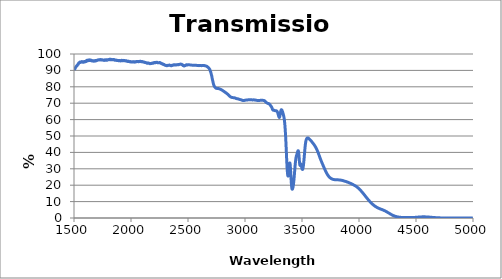
| Category | Transmission |
|---|---|
| 1500.0 | 90.192 |
| 1501.0 | 90.39 |
| 1502.0 | 90.507 |
| 1503.0 | 90.714 |
| 1504.0 | 90.801 |
| 1505.0 | 90.857 |
| 1506.0 | 90.826 |
| 1507.0 | 90.875 |
| 1508.0 | 91.009 |
| 1509.0 | 91.192 |
| 1510.0 | 91.222 |
| 1511.0 | 91.343 |
| 1512.0 | 91.464 |
| 1513.0 | 91.628 |
| 1514.0 | 91.71 |
| 1515.0 | 91.937 |
| 1516.0 | 92.037 |
| 1517.0 | 92.17 |
| 1518.0 | 92.23 |
| 1519.0 | 92.243 |
| 1520.0 | 92.317 |
| 1521.0 | 92.495 |
| 1522.0 | 92.629 |
| 1523.0 | 92.683 |
| 1524.0 | 92.743 |
| 1525.0 | 92.886 |
| 1526.0 | 92.887 |
| 1527.0 | 92.98 |
| 1528.0 | 92.962 |
| 1529.0 | 93.161 |
| 1530.0 | 93.221 |
| 1531.0 | 93.323 |
| 1532.0 | 93.479 |
| 1533.0 | 93.549 |
| 1534.0 | 93.686 |
| 1535.0 | 93.675 |
| 1536.0 | 93.721 |
| 1537.0 | 93.739 |
| 1538.0 | 93.876 |
| 1539.0 | 94.169 |
| 1540.0 | 94.277 |
| 1541.0 | 94.347 |
| 1542.0 | 94.496 |
| 1543.0 | 94.578 |
| 1544.0 | 94.555 |
| 1545.0 | 94.531 |
| 1546.0 | 94.59 |
| 1547.0 | 94.668 |
| 1548.0 | 94.731 |
| 1549.0 | 94.984 |
| 1550.0 | 94.973 |
| 1551.0 | 95.016 |
| 1552.0 | 95.062 |
| 1553.0 | 94.947 |
| 1554.0 | 94.846 |
| 1555.0 | 94.851 |
| 1556.0 | 94.975 |
| 1557.0 | 95.104 |
| 1558.0 | 95.114 |
| 1559.0 | 95.06 |
| 1560.0 | 95.008 |
| 1561.0 | 95.034 |
| 1562.0 | 95.023 |
| 1563.0 | 95.197 |
| 1564.0 | 95.193 |
| 1565.0 | 95.229 |
| 1566.0 | 95.118 |
| 1567.0 | 95.145 |
| 1568.0 | 95.323 |
| 1569.0 | 95.377 |
| 1570.0 | 95.363 |
| 1571.0 | 95.314 |
| 1572.0 | 95.086 |
| 1573.0 | 95.16 |
| 1574.0 | 95.29 |
| 1575.0 | 95.277 |
| 1576.0 | 95.332 |
| 1577.0 | 95.221 |
| 1578.0 | 94.993 |
| 1579.0 | 94.932 |
| 1580.0 | 94.945 |
| 1581.0 | 95.099 |
| 1582.0 | 95.196 |
| 1583.0 | 95.175 |
| 1584.0 | 95.117 |
| 1585.0 | 95.043 |
| 1586.0 | 95.085 |
| 1587.0 | 95.029 |
| 1588.0 | 95.163 |
| 1589.0 | 95.374 |
| 1590.0 | 95.246 |
| 1591.0 | 95.268 |
| 1592.0 | 95.325 |
| 1593.0 | 95.347 |
| 1594.0 | 95.393 |
| 1595.0 | 95.426 |
| 1596.0 | 95.442 |
| 1597.0 | 95.439 |
| 1598.0 | 95.24 |
| 1599.0 | 95.276 |
| 1600.0 | 95.303 |
| 1601.0 | 95.324 |
| 1602.0 | 95.355 |
| 1603.0 | 95.332 |
| 1604.0 | 95.357 |
| 1605.0 | 95.394 |
| 1606.0 | 95.512 |
| 1607.0 | 95.54 |
| 1608.0 | 95.638 |
| 1609.0 | 95.794 |
| 1610.0 | 95.909 |
| 1611.0 | 96.09 |
| 1612.0 | 96.094 |
| 1613.0 | 96.023 |
| 1614.0 | 96.055 |
| 1615.0 | 96.151 |
| 1616.0 | 96.242 |
| 1617.0 | 96.211 |
| 1618.0 | 96.172 |
| 1619.0 | 96.041 |
| 1620.0 | 95.819 |
| 1621.0 | 95.813 |
| 1622.0 | 95.86 |
| 1623.0 | 95.901 |
| 1624.0 | 96.059 |
| 1625.0 | 96.318 |
| 1626.0 | 96.321 |
| 1627.0 | 96.291 |
| 1628.0 | 96.278 |
| 1629.0 | 96.178 |
| 1630.0 | 96.104 |
| 1631.0 | 96.131 |
| 1632.0 | 96.218 |
| 1633.0 | 96.36 |
| 1634.0 | 96.412 |
| 1635.0 | 96.402 |
| 1636.0 | 96.258 |
| 1637.0 | 96.053 |
| 1638.0 | 96.035 |
| 1639.0 | 96.176 |
| 1640.0 | 96.398 |
| 1641.0 | 96.395 |
| 1642.0 | 96.276 |
| 1643.0 | 96.129 |
| 1644.0 | 96.094 |
| 1645.0 | 96.072 |
| 1646.0 | 96.179 |
| 1647.0 | 96.149 |
| 1648.0 | 96.19 |
| 1649.0 | 96.11 |
| 1650.0 | 95.949 |
| 1651.0 | 95.879 |
| 1652.0 | 95.954 |
| 1653.0 | 96.137 |
| 1654.0 | 96.154 |
| 1655.0 | 96.104 |
| 1656.0 | 96.026 |
| 1657.0 | 95.887 |
| 1658.0 | 95.745 |
| 1659.0 | 95.753 |
| 1660.0 | 95.731 |
| 1661.0 | 95.852 |
| 1662.0 | 95.941 |
| 1663.0 | 95.874 |
| 1664.0 | 95.876 |
| 1665.0 | 95.908 |
| 1666.0 | 95.904 |
| 1667.0 | 95.845 |
| 1668.0 | 95.808 |
| 1669.0 | 95.835 |
| 1670.0 | 95.864 |
| 1671.0 | 95.86 |
| 1672.0 | 95.788 |
| 1673.0 | 95.632 |
| 1674.0 | 95.595 |
| 1675.0 | 95.673 |
| 1676.0 | 95.668 |
| 1677.0 | 95.751 |
| 1678.0 | 95.862 |
| 1679.0 | 95.884 |
| 1680.0 | 95.919 |
| 1681.0 | 95.929 |
| 1682.0 | 95.798 |
| 1683.0 | 95.681 |
| 1684.0 | 95.704 |
| 1685.0 | 95.829 |
| 1686.0 | 95.945 |
| 1687.0 | 96.01 |
| 1688.0 | 96.076 |
| 1689.0 | 96.053 |
| 1690.0 | 95.92 |
| 1691.0 | 95.791 |
| 1692.0 | 95.814 |
| 1693.0 | 95.797 |
| 1694.0 | 95.892 |
| 1695.0 | 96.042 |
| 1696.0 | 96.017 |
| 1697.0 | 95.972 |
| 1698.0 | 96.06 |
| 1699.0 | 96.137 |
| 1700.0 | 96.049 |
| 1701.0 | 96.004 |
| 1702.0 | 96.073 |
| 1703.0 | 96.084 |
| 1704.0 | 96.167 |
| 1705.0 | 96.26 |
| 1706.0 | 96.259 |
| 1707.0 | 96.254 |
| 1708.0 | 96.308 |
| 1709.0 | 96.409 |
| 1710.0 | 96.33 |
| 1711.0 | 96.271 |
| 1712.0 | 96.323 |
| 1713.0 | 96.312 |
| 1714.0 | 96.309 |
| 1715.0 | 96.365 |
| 1716.0 | 96.413 |
| 1717.0 | 96.462 |
| 1718.0 | 96.512 |
| 1719.0 | 96.534 |
| 1720.0 | 96.553 |
| 1721.0 | 96.57 |
| 1722.0 | 96.489 |
| 1723.0 | 96.416 |
| 1724.0 | 96.401 |
| 1725.0 | 96.378 |
| 1726.0 | 96.332 |
| 1727.0 | 96.372 |
| 1728.0 | 96.398 |
| 1729.0 | 96.439 |
| 1730.0 | 96.564 |
| 1731.0 | 96.603 |
| 1732.0 | 96.508 |
| 1733.0 | 96.479 |
| 1734.0 | 96.547 |
| 1735.0 | 96.451 |
| 1736.0 | 96.393 |
| 1737.0 | 96.409 |
| 1738.0 | 96.375 |
| 1739.0 | 96.328 |
| 1740.0 | 96.346 |
| 1741.0 | 96.465 |
| 1742.0 | 96.57 |
| 1743.0 | 96.521 |
| 1744.0 | 96.49 |
| 1745.0 | 96.454 |
| 1746.0 | 96.409 |
| 1747.0 | 96.458 |
| 1748.0 | 96.489 |
| 1749.0 | 96.37 |
| 1750.0 | 96.33 |
| 1751.0 | 96.355 |
| 1752.0 | 96.297 |
| 1753.0 | 96.295 |
| 1754.0 | 96.267 |
| 1755.0 | 96.293 |
| 1756.0 | 96.22 |
| 1757.0 | 96.182 |
| 1758.0 | 96.198 |
| 1759.0 | 96.284 |
| 1760.0 | 96.258 |
| 1761.0 | 96.207 |
| 1762.0 | 96.209 |
| 1763.0 | 96.118 |
| 1764.0 | 96.062 |
| 1765.0 | 96.15 |
| 1766.0 | 96.146 |
| 1767.0 | 96.216 |
| 1768.0 | 96.203 |
| 1769.0 | 96.2 |
| 1770.0 | 96.359 |
| 1771.0 | 96.449 |
| 1772.0 | 96.456 |
| 1773.0 | 96.415 |
| 1774.0 | 96.347 |
| 1775.0 | 96.254 |
| 1776.0 | 96.317 |
| 1777.0 | 96.353 |
| 1778.0 | 96.186 |
| 1779.0 | 96.246 |
| 1780.0 | 96.381 |
| 1781.0 | 96.387 |
| 1782.0 | 96.231 |
| 1783.0 | 96.395 |
| 1784.0 | 96.26 |
| 1785.0 | 96.48 |
| 1786.0 | 96.549 |
| 1787.0 | 96.333 |
| 1788.0 | 96.288 |
| 1789.0 | 96.251 |
| 1790.0 | 96.186 |
| 1791.0 | 96.246 |
| 1792.0 | 96.293 |
| 1793.0 | 96.333 |
| 1794.0 | 96.481 |
| 1795.0 | 96.443 |
| 1796.0 | 96.433 |
| 1797.0 | 96.484 |
| 1798.0 | 96.421 |
| 1799.0 | 96.489 |
| 1800.0 | 96.562 |
| 1801.0 | 96.566 |
| 1802.0 | 96.513 |
| 1803.0 | 96.463 |
| 1804.0 | 96.418 |
| 1805.0 | 96.456 |
| 1806.0 | 96.573 |
| 1807.0 | 96.556 |
| 1808.0 | 96.441 |
| 1809.0 | 96.561 |
| 1810.0 | 96.66 |
| 1811.0 | 96.771 |
| 1812.0 | 96.768 |
| 1813.0 | 96.688 |
| 1814.0 | 96.746 |
| 1815.0 | 96.758 |
| 1816.0 | 96.737 |
| 1817.0 | 96.665 |
| 1818.0 | 96.54 |
| 1819.0 | 96.615 |
| 1820.0 | 96.733 |
| 1821.0 | 96.699 |
| 1822.0 | 96.573 |
| 1823.0 | 96.577 |
| 1824.0 | 96.633 |
| 1825.0 | 96.745 |
| 1826.0 | 96.654 |
| 1827.0 | 96.574 |
| 1828.0 | 96.552 |
| 1829.0 | 96.52 |
| 1830.0 | 96.514 |
| 1831.0 | 96.695 |
| 1832.0 | 96.664 |
| 1833.0 | 96.566 |
| 1834.0 | 96.586 |
| 1835.0 | 96.532 |
| 1836.0 | 96.456 |
| 1837.0 | 96.602 |
| 1838.0 | 96.582 |
| 1839.0 | 96.698 |
| 1840.0 | 96.606 |
| 1841.0 | 96.553 |
| 1842.0 | 96.569 |
| 1843.0 | 96.687 |
| 1844.0 | 96.623 |
| 1845.0 | 96.692 |
| 1846.0 | 96.578 |
| 1847.0 | 96.516 |
| 1848.0 | 96.602 |
| 1849.0 | 96.57 |
| 1850.0 | 96.588 |
| 1851.0 | 96.606 |
| 1852.0 | 96.56 |
| 1853.0 | 96.413 |
| 1854.0 | 96.379 |
| 1855.0 | 96.311 |
| 1856.0 | 96.377 |
| 1857.0 | 96.361 |
| 1858.0 | 96.372 |
| 1859.0 | 96.21 |
| 1860.0 | 96.122 |
| 1861.0 | 96.185 |
| 1862.0 | 96.26 |
| 1863.0 | 96.2 |
| 1864.0 | 96.22 |
| 1865.0 | 96.229 |
| 1866.0 | 96.241 |
| 1867.0 | 96.338 |
| 1868.0 | 96.311 |
| 1869.0 | 96.269 |
| 1870.0 | 96.196 |
| 1871.0 | 96.141 |
| 1872.0 | 96.145 |
| 1873.0 | 96.147 |
| 1874.0 | 96.06 |
| 1875.0 | 96.119 |
| 1876.0 | 96.103 |
| 1877.0 | 96.079 |
| 1878.0 | 96.031 |
| 1879.0 | 96.038 |
| 1880.0 | 96.005 |
| 1881.0 | 96.116 |
| 1882.0 | 96.1 |
| 1883.0 | 96.053 |
| 1884.0 | 96.017 |
| 1885.0 | 96.053 |
| 1886.0 | 96.106 |
| 1887.0 | 96.084 |
| 1888.0 | 95.973 |
| 1889.0 | 95.901 |
| 1890.0 | 95.992 |
| 1891.0 | 95.876 |
| 1892.0 | 95.848 |
| 1893.0 | 95.936 |
| 1894.0 | 95.918 |
| 1895.0 | 95.916 |
| 1896.0 | 95.835 |
| 1897.0 | 95.879 |
| 1898.0 | 96.025 |
| 1899.0 | 95.989 |
| 1900.0 | 95.948 |
| 1901.0 | 95.973 |
| 1902.0 | 95.957 |
| 1903.0 | 95.895 |
| 1904.0 | 95.92 |
| 1905.0 | 95.805 |
| 1906.0 | 95.885 |
| 1907.0 | 95.932 |
| 1908.0 | 95.792 |
| 1909.0 | 95.858 |
| 1910.0 | 96.01 |
| 1911.0 | 95.993 |
| 1912.0 | 96.014 |
| 1913.0 | 95.99 |
| 1914.0 | 95.96 |
| 1915.0 | 95.998 |
| 1916.0 | 95.946 |
| 1917.0 | 96.025 |
| 1918.0 | 96.155 |
| 1919.0 | 96.14 |
| 1920.0 | 96.002 |
| 1921.0 | 95.866 |
| 1922.0 | 95.896 |
| 1923.0 | 95.976 |
| 1924.0 | 96.004 |
| 1925.0 | 95.912 |
| 1926.0 | 95.844 |
| 1927.0 | 95.857 |
| 1928.0 | 95.909 |
| 1929.0 | 95.971 |
| 1930.0 | 96.031 |
| 1931.0 | 96.027 |
| 1932.0 | 96.03 |
| 1933.0 | 96.037 |
| 1934.0 | 96.068 |
| 1935.0 | 96.123 |
| 1936.0 | 96.079 |
| 1937.0 | 96.043 |
| 1938.0 | 96 |
| 1939.0 | 95.918 |
| 1940.0 | 95.862 |
| 1941.0 | 95.817 |
| 1942.0 | 95.878 |
| 1943.0 | 96.026 |
| 1944.0 | 96.092 |
| 1945.0 | 95.973 |
| 1946.0 | 95.929 |
| 1947.0 | 95.837 |
| 1948.0 | 95.857 |
| 1949.0 | 95.928 |
| 1950.0 | 95.846 |
| 1951.0 | 95.877 |
| 1952.0 | 95.93 |
| 1953.0 | 95.9 |
| 1954.0 | 95.937 |
| 1955.0 | 95.898 |
| 1956.0 | 95.722 |
| 1957.0 | 95.716 |
| 1958.0 | 95.904 |
| 1959.0 | 95.931 |
| 1960.0 | 95.758 |
| 1961.0 | 95.658 |
| 1962.0 | 95.811 |
| 1963.0 | 95.784 |
| 1964.0 | 95.649 |
| 1965.0 | 95.649 |
| 1966.0 | 95.541 |
| 1967.0 | 95.611 |
| 1968.0 | 95.575 |
| 1969.0 | 95.508 |
| 1970.0 | 95.47 |
| 1971.0 | 95.588 |
| 1972.0 | 95.594 |
| 1973.0 | 95.463 |
| 1974.0 | 95.442 |
| 1975.0 | 95.489 |
| 1976.0 | 95.626 |
| 1977.0 | 95.569 |
| 1978.0 | 95.436 |
| 1979.0 | 95.44 |
| 1980.0 | 95.452 |
| 1981.0 | 95.471 |
| 1982.0 | 95.511 |
| 1983.0 | 95.519 |
| 1984.0 | 95.467 |
| 1985.0 | 95.451 |
| 1986.0 | 95.414 |
| 1987.0 | 95.437 |
| 1988.0 | 95.436 |
| 1989.0 | 95.334 |
| 1990.0 | 95.21 |
| 1991.0 | 95.278 |
| 1992.0 | 95.285 |
| 1993.0 | 95.342 |
| 1994.0 | 95.434 |
| 1995.0 | 95.331 |
| 1996.0 | 95.303 |
| 1997.0 | 95.329 |
| 1998.0 | 95.16 |
| 1999.0 | 95.05 |
| 2000.0 | 95.123 |
| 2001.0 | 95.2 |
| 2002.0 | 95.146 |
| 2003.0 | 95.119 |
| 2004.0 | 95.161 |
| 2005.0 | 95.145 |
| 2006.0 | 95.111 |
| 2007.0 | 95.065 |
| 2008.0 | 95.062 |
| 2009.0 | 95.163 |
| 2010.0 | 95.229 |
| 2011.0 | 95.21 |
| 2012.0 | 95.189 |
| 2013.0 | 95.219 |
| 2014.0 | 95.203 |
| 2015.0 | 95.133 |
| 2016.0 | 95.093 |
| 2017.0 | 95.086 |
| 2018.0 | 95.083 |
| 2019.0 | 95.143 |
| 2020.0 | 95.219 |
| 2021.0 | 95.249 |
| 2022.0 | 95.295 |
| 2023.0 | 95.358 |
| 2024.0 | 95.331 |
| 2025.0 | 95.306 |
| 2026.0 | 95.237 |
| 2027.0 | 95.181 |
| 2028.0 | 95.143 |
| 2029.0 | 95.039 |
| 2030.0 | 95.092 |
| 2031.0 | 95.241 |
| 2032.0 | 95.286 |
| 2033.0 | 95.302 |
| 2034.0 | 95.308 |
| 2035.0 | 95.296 |
| 2036.0 | 95.334 |
| 2037.0 | 95.323 |
| 2038.0 | 95.274 |
| 2039.0 | 95.251 |
| 2040.0 | 95.19 |
| 2041.0 | 95.181 |
| 2042.0 | 95.26 |
| 2043.0 | 95.303 |
| 2044.0 | 95.299 |
| 2045.0 | 95.362 |
| 2046.0 | 95.371 |
| 2047.0 | 95.317 |
| 2048.0 | 95.362 |
| 2049.0 | 95.425 |
| 2050.0 | 95.344 |
| 2051.0 | 95.29 |
| 2052.0 | 95.362 |
| 2053.0 | 95.406 |
| 2054.0 | 95.435 |
| 2055.0 | 95.47 |
| 2056.0 | 95.398 |
| 2057.0 | 95.386 |
| 2058.0 | 95.467 |
| 2059.0 | 95.48 |
| 2060.0 | 95.419 |
| 2061.0 | 95.423 |
| 2062.0 | 95.412 |
| 2063.0 | 95.341 |
| 2064.0 | 95.332 |
| 2065.0 | 95.405 |
| 2066.0 | 95.473 |
| 2067.0 | 95.446 |
| 2068.0 | 95.355 |
| 2069.0 | 95.317 |
| 2070.0 | 95.324 |
| 2071.0 | 95.352 |
| 2072.0 | 95.374 |
| 2073.0 | 95.406 |
| 2074.0 | 95.379 |
| 2075.0 | 95.418 |
| 2076.0 | 95.504 |
| 2077.0 | 95.538 |
| 2078.0 | 95.496 |
| 2079.0 | 95.478 |
| 2080.0 | 95.502 |
| 2081.0 | 95.443 |
| 2082.0 | 95.363 |
| 2083.0 | 95.457 |
| 2084.0 | 95.541 |
| 2085.0 | 95.489 |
| 2086.0 | 95.401 |
| 2087.0 | 95.357 |
| 2088.0 | 95.369 |
| 2089.0 | 95.344 |
| 2090.0 | 95.303 |
| 2091.0 | 95.315 |
| 2092.0 | 95.29 |
| 2093.0 | 95.245 |
| 2094.0 | 95.243 |
| 2095.0 | 95.312 |
| 2096.0 | 95.408 |
| 2097.0 | 95.418 |
| 2098.0 | 95.284 |
| 2099.0 | 95.339 |
| 2100.0 | 95.315 |
| 2101.0 | 95.23 |
| 2102.0 | 95.283 |
| 2103.0 | 95.333 |
| 2104.0 | 95.245 |
| 2105.0 | 95.127 |
| 2106.0 | 95.127 |
| 2107.0 | 95.159 |
| 2108.0 | 95.115 |
| 2109.0 | 95.109 |
| 2110.0 | 95.09 |
| 2111.0 | 95.097 |
| 2112.0 | 95.146 |
| 2113.0 | 95.068 |
| 2114.0 | 95.014 |
| 2115.0 | 94.998 |
| 2116.0 | 95 |
| 2117.0 | 95.021 |
| 2118.0 | 94.968 |
| 2119.0 | 94.886 |
| 2120.0 | 94.867 |
| 2121.0 | 94.92 |
| 2122.0 | 94.928 |
| 2123.0 | 94.86 |
| 2124.0 | 94.849 |
| 2125.0 | 94.841 |
| 2126.0 | 94.833 |
| 2127.0 | 94.781 |
| 2128.0 | 94.764 |
| 2129.0 | 94.744 |
| 2130.0 | 94.705 |
| 2131.0 | 94.692 |
| 2132.0 | 94.675 |
| 2133.0 | 94.685 |
| 2134.0 | 94.703 |
| 2135.0 | 94.683 |
| 2136.0 | 94.686 |
| 2137.0 | 94.614 |
| 2138.0 | 94.541 |
| 2139.0 | 94.422 |
| 2140.0 | 94.367 |
| 2141.0 | 94.401 |
| 2142.0 | 94.422 |
| 2143.0 | 94.379 |
| 2144.0 | 94.399 |
| 2145.0 | 94.508 |
| 2146.0 | 94.494 |
| 2147.0 | 94.464 |
| 2148.0 | 94.4 |
| 2149.0 | 94.418 |
| 2150.0 | 94.375 |
| 2151.0 | 94.414 |
| 2152.0 | 94.531 |
| 2153.0 | 94.473 |
| 2154.0 | 94.396 |
| 2155.0 | 94.348 |
| 2156.0 | 94.412 |
| 2157.0 | 94.394 |
| 2158.0 | 94.39 |
| 2159.0 | 94.33 |
| 2160.0 | 94.383 |
| 2161.0 | 94.292 |
| 2162.0 | 94.263 |
| 2163.0 | 94.232 |
| 2164.0 | 94.211 |
| 2165.0 | 94.122 |
| 2166.0 | 94.161 |
| 2167.0 | 94.188 |
| 2168.0 | 94.126 |
| 2169.0 | 94.125 |
| 2170.0 | 94.22 |
| 2171.0 | 94.259 |
| 2172.0 | 94.191 |
| 2173.0 | 94.23 |
| 2174.0 | 94.226 |
| 2175.0 | 94.183 |
| 2176.0 | 94.206 |
| 2177.0 | 94.228 |
| 2178.0 | 94.241 |
| 2179.0 | 94.198 |
| 2180.0 | 94.196 |
| 2181.0 | 94.234 |
| 2182.0 | 94.224 |
| 2183.0 | 94.313 |
| 2184.0 | 94.342 |
| 2185.0 | 94.384 |
| 2186.0 | 94.488 |
| 2187.0 | 94.524 |
| 2188.0 | 94.536 |
| 2189.0 | 94.45 |
| 2190.0 | 94.406 |
| 2191.0 | 94.414 |
| 2192.0 | 94.454 |
| 2193.0 | 94.41 |
| 2194.0 | 94.367 |
| 2195.0 | 94.455 |
| 2196.0 | 94.438 |
| 2197.0 | 94.496 |
| 2198.0 | 94.593 |
| 2199.0 | 94.607 |
| 2200.0 | 94.708 |
| 2201.0 | 94.763 |
| 2202.0 | 94.661 |
| 2203.0 | 94.676 |
| 2204.0 | 94.633 |
| 2205.0 | 94.597 |
| 2206.0 | 94.663 |
| 2207.0 | 94.693 |
| 2208.0 | 94.727 |
| 2209.0 | 94.795 |
| 2210.0 | 94.809 |
| 2211.0 | 94.817 |
| 2212.0 | 94.865 |
| 2213.0 | 94.804 |
| 2214.0 | 94.706 |
| 2215.0 | 94.714 |
| 2216.0 | 94.767 |
| 2217.0 | 94.69 |
| 2218.0 | 94.789 |
| 2219.0 | 94.852 |
| 2220.0 | 94.881 |
| 2221.0 | 94.914 |
| 2222.0 | 94.786 |
| 2223.0 | 94.819 |
| 2224.0 | 94.788 |
| 2225.0 | 94.777 |
| 2226.0 | 94.808 |
| 2227.0 | 94.811 |
| 2228.0 | 94.799 |
| 2229.0 | 94.931 |
| 2230.0 | 94.751 |
| 2231.0 | 94.707 |
| 2232.0 | 94.781 |
| 2233.0 | 94.743 |
| 2234.0 | 94.814 |
| 2235.0 | 94.767 |
| 2236.0 | 94.759 |
| 2237.0 | 94.744 |
| 2238.0 | 94.736 |
| 2239.0 | 94.683 |
| 2240.0 | 94.714 |
| 2241.0 | 94.702 |
| 2242.0 | 94.627 |
| 2243.0 | 94.643 |
| 2244.0 | 94.649 |
| 2245.0 | 94.665 |
| 2246.0 | 94.619 |
| 2247.0 | 94.703 |
| 2248.0 | 94.676 |
| 2249.0 | 94.782 |
| 2250.0 | 94.798 |
| 2251.0 | 94.865 |
| 2252.0 | 94.732 |
| 2253.0 | 94.626 |
| 2254.0 | 94.586 |
| 2255.0 | 94.668 |
| 2256.0 | 94.57 |
| 2257.0 | 94.63 |
| 2258.0 | 94.647 |
| 2259.0 | 94.524 |
| 2260.0 | 94.447 |
| 2261.0 | 94.406 |
| 2262.0 | 94.436 |
| 2263.0 | 94.345 |
| 2264.0 | 94.362 |
| 2265.0 | 94.335 |
| 2266.0 | 94.231 |
| 2267.0 | 94.099 |
| 2268.0 | 94.095 |
| 2269.0 | 94.077 |
| 2270.0 | 94.099 |
| 2271.0 | 94.116 |
| 2272.0 | 94.103 |
| 2273.0 | 94.103 |
| 2274.0 | 94.031 |
| 2275.0 | 94.09 |
| 2276.0 | 94.035 |
| 2277.0 | 93.987 |
| 2278.0 | 93.967 |
| 2279.0 | 93.922 |
| 2280.0 | 93.862 |
| 2281.0 | 93.888 |
| 2282.0 | 93.845 |
| 2283.0 | 93.728 |
| 2284.0 | 93.55 |
| 2285.0 | 93.646 |
| 2286.0 | 93.633 |
| 2287.0 | 93.629 |
| 2288.0 | 93.697 |
| 2289.0 | 93.658 |
| 2290.0 | 93.545 |
| 2291.0 | 93.454 |
| 2292.0 | 93.427 |
| 2293.0 | 93.411 |
| 2294.0 | 93.364 |
| 2295.0 | 93.304 |
| 2296.0 | 93.283 |
| 2297.0 | 93.212 |
| 2298.0 | 93.225 |
| 2299.0 | 93.124 |
| 2300.0 | 93.115 |
| 2301.0 | 93.134 |
| 2302.0 | 93.148 |
| 2303.0 | 93.172 |
| 2304.0 | 93.169 |
| 2305.0 | 93.085 |
| 2306.0 | 93.014 |
| 2307.0 | 92.978 |
| 2308.0 | 92.991 |
| 2309.0 | 92.92 |
| 2310.0 | 92.934 |
| 2311.0 | 92.957 |
| 2312.0 | 92.91 |
| 2313.0 | 92.862 |
| 2314.0 | 92.888 |
| 2315.0 | 92.9 |
| 2316.0 | 92.866 |
| 2317.0 | 92.897 |
| 2318.0 | 92.948 |
| 2319.0 | 93.019 |
| 2320.0 | 93.045 |
| 2321.0 | 92.99 |
| 2322.0 | 93.004 |
| 2323.0 | 92.987 |
| 2324.0 | 93.068 |
| 2325.0 | 93.117 |
| 2326.0 | 93.148 |
| 2327.0 | 93.068 |
| 2328.0 | 93.078 |
| 2329.0 | 93.185 |
| 2330.0 | 93.172 |
| 2331.0 | 93.172 |
| 2332.0 | 93.214 |
| 2333.0 | 93.185 |
| 2334.0 | 93.159 |
| 2335.0 | 93.22 |
| 2336.0 | 93.212 |
| 2337.0 | 93.22 |
| 2338.0 | 93.231 |
| 2339.0 | 93.214 |
| 2340.0 | 93.225 |
| 2341.0 | 93.173 |
| 2342.0 | 93.144 |
| 2343.0 | 93.08 |
| 2344.0 | 93.017 |
| 2345.0 | 93.023 |
| 2346.0 | 93.044 |
| 2347.0 | 93.006 |
| 2348.0 | 92.934 |
| 2349.0 | 92.913 |
| 2350.0 | 92.991 |
| 2351.0 | 92.907 |
| 2352.0 | 92.843 |
| 2353.0 | 92.86 |
| 2354.0 | 92.947 |
| 2355.0 | 92.926 |
| 2356.0 | 92.873 |
| 2357.0 | 92.902 |
| 2358.0 | 92.92 |
| 2359.0 | 92.92 |
| 2360.0 | 92.952 |
| 2361.0 | 92.96 |
| 2362.0 | 93.029 |
| 2363.0 | 93.193 |
| 2364.0 | 93.193 |
| 2365.0 | 93.186 |
| 2366.0 | 93.148 |
| 2367.0 | 93.132 |
| 2368.0 | 93.123 |
| 2369.0 | 93.178 |
| 2370.0 | 93.233 |
| 2371.0 | 93.306 |
| 2372.0 | 93.337 |
| 2373.0 | 93.325 |
| 2374.0 | 93.353 |
| 2375.0 | 93.4 |
| 2376.0 | 93.43 |
| 2377.0 | 93.342 |
| 2378.0 | 93.352 |
| 2379.0 | 93.366 |
| 2380.0 | 93.362 |
| 2381.0 | 93.324 |
| 2382.0 | 93.33 |
| 2383.0 | 93.399 |
| 2384.0 | 93.424 |
| 2385.0 | 93.401 |
| 2386.0 | 93.4 |
| 2387.0 | 93.353 |
| 2388.0 | 93.319 |
| 2389.0 | 93.273 |
| 2390.0 | 93.263 |
| 2391.0 | 93.263 |
| 2392.0 | 93.267 |
| 2393.0 | 93.304 |
| 2394.0 | 93.369 |
| 2395.0 | 93.4 |
| 2396.0 | 93.398 |
| 2397.0 | 93.356 |
| 2398.0 | 93.346 |
| 2399.0 | 93.364 |
| 2400.0 | 93.415 |
| 2401.0 | 93.421 |
| 2402.0 | 93.406 |
| 2403.0 | 93.403 |
| 2404.0 | 93.424 |
| 2405.0 | 93.456 |
| 2406.0 | 93.466 |
| 2407.0 | 93.427 |
| 2408.0 | 93.41 |
| 2409.0 | 93.452 |
| 2410.0 | 93.459 |
| 2411.0 | 93.437 |
| 2412.0 | 93.493 |
| 2413.0 | 93.535 |
| 2414.0 | 93.608 |
| 2415.0 | 93.655 |
| 2416.0 | 93.603 |
| 2417.0 | 93.571 |
| 2418.0 | 93.513 |
| 2419.0 | 93.478 |
| 2420.0 | 93.527 |
| 2421.0 | 93.576 |
| 2422.0 | 93.576 |
| 2423.0 | 93.593 |
| 2424.0 | 93.613 |
| 2425.0 | 93.646 |
| 2426.0 | 93.671 |
| 2427.0 | 93.689 |
| 2428.0 | 93.747 |
| 2429.0 | 93.762 |
| 2430.0 | 93.747 |
| 2431.0 | 93.765 |
| 2432.0 | 93.827 |
| 2433.0 | 93.864 |
| 2434.0 | 93.813 |
| 2435.0 | 93.768 |
| 2436.0 | 93.747 |
| 2437.0 | 93.719 |
| 2438.0 | 93.708 |
| 2439.0 | 93.732 |
| 2440.0 | 93.751 |
| 2441.0 | 93.744 |
| 2442.0 | 93.755 |
| 2443.0 | 93.789 |
| 2444.0 | 93.723 |
| 2445.0 | 93.701 |
| 2446.0 | 93.597 |
| 2447.0 | 93.475 |
| 2448.0 | 93.451 |
| 2449.0 | 93.478 |
| 2450.0 | 93.448 |
| 2451.0 | 93.377 |
| 2452.0 | 93.379 |
| 2453.0 | 93.324 |
| 2454.0 | 93.236 |
| 2455.0 | 93.171 |
| 2456.0 | 93.046 |
| 2457.0 | 92.934 |
| 2458.0 | 92.922 |
| 2459.0 | 92.937 |
| 2460.0 | 92.871 |
| 2461.0 | 92.847 |
| 2462.0 | 92.847 |
| 2463.0 | 92.838 |
| 2464.0 | 92.752 |
| 2465.0 | 92.706 |
| 2466.0 | 92.697 |
| 2467.0 | 92.706 |
| 2468.0 | 92.702 |
| 2469.0 | 92.762 |
| 2470.0 | 92.828 |
| 2471.0 | 92.865 |
| 2472.0 | 92.886 |
| 2473.0 | 92.963 |
| 2474.0 | 93.018 |
| 2475.0 | 93.003 |
| 2476.0 | 92.943 |
| 2477.0 | 92.983 |
| 2478.0 | 93.032 |
| 2479.0 | 93.156 |
| 2480.0 | 93.173 |
| 2481.0 | 93.186 |
| 2482.0 | 93.16 |
| 2483.0 | 93.193 |
| 2484.0 | 93.242 |
| 2485.0 | 93.382 |
| 2486.0 | 93.433 |
| 2487.0 | 93.334 |
| 2488.0 | 93.295 |
| 2489.0 | 93.233 |
| 2490.0 | 93.292 |
| 2491.0 | 93.349 |
| 2492.0 | 93.297 |
| 2493.0 | 93.269 |
| 2494.0 | 93.35 |
| 2495.0 | 93.34 |
| 2496.0 | 93.338 |
| 2497.0 | 93.38 |
| 2498.0 | 93.437 |
| 2499.0 | 93.424 |
| 2500.0 | 93.408 |
| 2501.19 | 93.426 |
| 2503.12 | 93.426 |
| 2505.05 | 93.41 |
| 2506.97 | 93.403 |
| 2508.9 | 93.407 |
| 2510.83 | 93.405 |
| 2512.76 | 93.388 |
| 2514.69 | 93.372 |
| 2516.62 | 93.354 |
| 2518.54 | 93.323 |
| 2520.47 | 93.295 |
| 2522.4 | 93.28 |
| 2524.33 | 93.267 |
| 2526.26 | 93.254 |
| 2528.19 | 93.247 |
| 2530.12 | 93.238 |
| 2532.04 | 93.22 |
| 2533.97 | 93.211 |
| 2535.9 | 93.206 |
| 2537.83 | 93.195 |
| 2539.76 | 93.185 |
| 2541.69 | 93.172 |
| 2543.61 | 93.139 |
| 2545.54 | 93.114 |
| 2547.47 | 93.123 |
| 2549.4 | 93.13 |
| 2551.33 | 93.126 |
| 2553.26 | 93.119 |
| 2555.18 | 93.114 |
| 2557.11 | 93.111 |
| 2559.04 | 93.112 |
| 2560.97 | 93.107 |
| 2562.9 | 93.078 |
| 2564.83 | 93.062 |
| 2566.76 | 93.077 |
| 2568.68 | 93.085 |
| 2570.61 | 93.072 |
| 2572.54 | 93.079 |
| 2574.47 | 93.07 |
| 2576.4 | 93.041 |
| 2578.33 | 93.027 |
| 2580.25 | 93.025 |
| 2582.18 | 93.005 |
| 2584.11 | 92.977 |
| 2586.04 | 92.979 |
| 2587.97 | 92.976 |
| 2589.9 | 92.955 |
| 2591.83 | 92.952 |
| 2593.75 | 92.941 |
| 2595.68 | 92.902 |
| 2597.61 | 92.911 |
| 2599.54 | 92.953 |
| 2601.47 | 92.99 |
| 2603.4 | 93.008 |
| 2605.32 | 92.982 |
| 2607.25 | 92.95 |
| 2609.18 | 92.942 |
| 2611.11 | 92.94 |
| 2613.04 | 92.938 |
| 2614.97 | 92.934 |
| 2616.9 | 92.911 |
| 2618.82 | 92.891 |
| 2620.75 | 92.894 |
| 2622.68 | 92.912 |
| 2624.61 | 92.942 |
| 2626.54 | 92.943 |
| 2628.47 | 92.934 |
| 2630.39 | 92.925 |
| 2632.32 | 92.911 |
| 2634.25 | 92.912 |
| 2636.18 | 92.917 |
| 2638.11 | 92.928 |
| 2640.04 | 92.935 |
| 2641.96 | 92.931 |
| 2643.89 | 92.923 |
| 2645.82 | 92.902 |
| 2647.75 | 92.855 |
| 2649.68 | 92.814 |
| 2651.61 | 92.787 |
| 2653.54 | 92.761 |
| 2655.46 | 92.726 |
| 2657.39 | 92.684 |
| 2659.32 | 92.634 |
| 2661.25 | 92.575 |
| 2663.18 | 92.532 |
| 2665.11 | 92.446 |
| 2667.03 | 92.314 |
| 2668.96 | 92.233 |
| 2670.89 | 92.134 |
| 2672.82 | 92.043 |
| 2674.75 | 91.981 |
| 2676.68 | 91.856 |
| 2678.61 | 91.666 |
| 2680.53 | 91.53 |
| 2682.46 | 91.425 |
| 2684.39 | 91.272 |
| 2686.32 | 91.074 |
| 2688.25 | 90.856 |
| 2690.18 | 90.635 |
| 2692.1 | 90.403 |
| 2694.03 | 90.049 |
| 2695.96 | 89.591 |
| 2697.89 | 89.212 |
| 2699.82 | 88.833 |
| 2701.75 | 88.329 |
| 2703.67 | 87.787 |
| 2705.6 | 87.294 |
| 2707.53 | 86.794 |
| 2709.46 | 86.16 |
| 2711.39 | 85.348 |
| 2713.32 | 84.668 |
| 2715.25 | 84.14 |
| 2717.17 | 83.621 |
| 2719.1 | 83.072 |
| 2721.03 | 82.401 |
| 2722.96 | 81.834 |
| 2724.89 | 81.358 |
| 2726.82 | 80.925 |
| 2728.74 | 80.616 |
| 2730.67 | 80.362 |
| 2732.6 | 80.15 |
| 2734.53 | 79.943 |
| 2736.46 | 79.76 |
| 2738.39 | 79.641 |
| 2740.32 | 79.477 |
| 2742.24 | 79.297 |
| 2744.17 | 79.211 |
| 2746.1 | 79.15 |
| 2748.03 | 79.096 |
| 2749.96 | 79.06 |
| 2751.89 | 79.038 |
| 2753.81 | 79.02 |
| 2755.74 | 78.98 |
| 2757.67 | 78.953 |
| 2759.6 | 78.958 |
| 2761.53 | 78.961 |
| 2763.46 | 78.952 |
| 2765.39 | 78.943 |
| 2767.31 | 78.933 |
| 2769.24 | 78.909 |
| 2771.17 | 78.864 |
| 2773.1 | 78.81 |
| 2775.03 | 78.763 |
| 2776.96 | 78.708 |
| 2778.88 | 78.642 |
| 2780.81 | 78.582 |
| 2782.74 | 78.53 |
| 2784.67 | 78.483 |
| 2786.6 | 78.43 |
| 2788.53 | 78.364 |
| 2790.45 | 78.305 |
| 2792.38 | 78.241 |
| 2794.31 | 78.157 |
| 2796.24 | 78.065 |
| 2798.17 | 77.98 |
| 2800.1 | 77.91 |
| 2802.03 | 77.828 |
| 2803.95 | 77.71 |
| 2805.88 | 77.6 |
| 2807.81 | 77.52 |
| 2809.74 | 77.435 |
| 2811.67 | 77.341 |
| 2813.6 | 77.247 |
| 2815.52 | 77.157 |
| 2817.45 | 77.076 |
| 2819.38 | 76.997 |
| 2821.31 | 76.902 |
| 2823.24 | 76.799 |
| 2825.17 | 76.702 |
| 2827.1 | 76.607 |
| 2829.02 | 76.51 |
| 2830.95 | 76.409 |
| 2832.88 | 76.31 |
| 2834.81 | 76.214 |
| 2836.74 | 76.116 |
| 2838.67 | 76.008 |
| 2840.59 | 75.899 |
| 2842.52 | 75.796 |
| 2844.45 | 75.695 |
| 2846.38 | 75.592 |
| 2848.31 | 75.479 |
| 2850.24 | 75.357 |
| 2852.16 | 75.236 |
| 2854.09 | 75.108 |
| 2856.02 | 74.968 |
| 2857.95 | 74.83 |
| 2859.88 | 74.694 |
| 2861.81 | 74.558 |
| 2863.74 | 74.43 |
| 2865.66 | 74.307 |
| 2867.59 | 74.187 |
| 2869.52 | 74.07 |
| 2871.45 | 73.96 |
| 2873.38 | 73.864 |
| 2875.31 | 73.777 |
| 2877.23 | 73.695 |
| 2879.16 | 73.627 |
| 2881.09 | 73.582 |
| 2883.02 | 73.549 |
| 2884.95 | 73.52 |
| 2886.88 | 73.49 |
| 2888.81 | 73.465 |
| 2890.73 | 73.444 |
| 2892.66 | 73.42 |
| 2894.59 | 73.399 |
| 2896.52 | 73.387 |
| 2898.45 | 73.38 |
| 2900.38 | 73.366 |
| 2902.3 | 73.345 |
| 2904.23 | 73.322 |
| 2906.16 | 73.296 |
| 2908.09 | 73.27 |
| 2910.02 | 73.241 |
| 2911.95 | 73.204 |
| 2913.88 | 73.157 |
| 2915.8 | 73.103 |
| 2917.73 | 73.04 |
| 2919.66 | 72.972 |
| 2921.59 | 72.907 |
| 2923.52 | 72.851 |
| 2925.45 | 72.808 |
| 2927.37 | 72.784 |
| 2929.3 | 72.77 |
| 2931.23 | 72.751 |
| 2933.16 | 72.723 |
| 2935.09 | 72.694 |
| 2937.02 | 72.665 |
| 2938.94 | 72.63 |
| 2940.87 | 72.588 |
| 2942.8 | 72.544 |
| 2944.73 | 72.5 |
| 2946.66 | 72.461 |
| 2948.59 | 72.425 |
| 2950.52 | 72.383 |
| 2952.44 | 72.336 |
| 2954.37 | 72.29 |
| 2956.3 | 72.246 |
| 2958.23 | 72.206 |
| 2960.16 | 72.169 |
| 2962.09 | 72.132 |
| 2964.01 | 72.095 |
| 2965.94 | 72.057 |
| 2967.87 | 72.014 |
| 2969.8 | 71.957 |
| 2971.73 | 71.892 |
| 2973.66 | 71.831 |
| 2975.59 | 71.776 |
| 2977.51 | 71.727 |
| 2979.44 | 71.686 |
| 2981.37 | 71.654 |
| 2983.3 | 71.634 |
| 2985.23 | 71.626 |
| 2987.16 | 71.626 |
| 2989.08 | 71.631 |
| 2991.01 | 71.649 |
| 2992.94 | 71.681 |
| 2994.87 | 71.718 |
| 2996.8 | 71.749 |
| 2998.73 | 71.776 |
| 3000.65 | 71.801 |
| 3002.58 | 71.827 |
| 3004.51 | 71.854 |
| 3006.44 | 71.876 |
| 3008.37 | 71.891 |
| 3010.3 | 71.904 |
| 3012.23 | 71.917 |
| 3014.15 | 71.928 |
| 3016.08 | 71.94 |
| 3018.01 | 71.958 |
| 3019.94 | 71.979 |
| 3021.87 | 72 |
| 3023.8 | 72.018 |
| 3025.72 | 72.034 |
| 3027.65 | 72.048 |
| 3029.58 | 72.064 |
| 3031.51 | 72.081 |
| 3033.44 | 72.095 |
| 3035.37 | 72.106 |
| 3037.3 | 72.116 |
| 3039.22 | 72.125 |
| 3041.15 | 72.133 |
| 3043.08 | 72.139 |
| 3045.01 | 72.143 |
| 3046.94 | 72.145 |
| 3048.87 | 72.142 |
| 3050.79 | 72.134 |
| 3052.72 | 72.121 |
| 3054.65 | 72.106 |
| 3056.58 | 72.089 |
| 3058.51 | 72.067 |
| 3060.44 | 72.042 |
| 3062.36 | 72.016 |
| 3064.29 | 71.996 |
| 3066.22 | 71.988 |
| 3068.15 | 71.992 |
| 3070.08 | 72.007 |
| 3072.01 | 72.023 |
| 3073.94 | 72.035 |
| 3075.86 | 72.04 |
| 3077.79 | 72.039 |
| 3079.72 | 72.032 |
| 3081.65 | 72.017 |
| 3083.58 | 71.995 |
| 3085.51 | 71.972 |
| 3087.43 | 71.953 |
| 3089.36 | 71.935 |
| 3091.29 | 71.91 |
| 3093.22 | 71.878 |
| 3095.15 | 71.843 |
| 3097.08 | 71.812 |
| 3099.01 | 71.785 |
| 3100.93 | 71.76 |
| 3102.86 | 71.735 |
| 3104.79 | 71.707 |
| 3106.72 | 71.677 |
| 3108.65 | 71.648 |
| 3110.58 | 71.623 |
| 3112.5 | 71.606 |
| 3114.43 | 71.599 |
| 3116.36 | 71.6 |
| 3118.29 | 71.606 |
| 3120.22 | 71.616 |
| 3122.15 | 71.63 |
| 3124.08 | 71.648 |
| 3126.0 | 71.669 |
| 3127.93 | 71.69 |
| 3129.86 | 71.71 |
| 3131.79 | 71.724 |
| 3133.72 | 71.733 |
| 3135.65 | 71.739 |
| 3137.57 | 71.746 |
| 3139.5 | 71.754 |
| 3141.43 | 71.764 |
| 3143.36 | 71.774 |
| 3145.29 | 71.78 |
| 3147.22 | 71.784 |
| 3149.14 | 71.787 |
| 3151.07 | 71.789 |
| 3153.0 | 71.786 |
| 3154.93 | 71.772 |
| 3156.86 | 71.751 |
| 3158.79 | 71.728 |
| 3160.72 | 71.708 |
| 3162.64 | 71.688 |
| 3164.57 | 71.664 |
| 3166.5 | 71.633 |
| 3168.43 | 71.594 |
| 3170.36 | 71.54 |
| 3172.29 | 71.461 |
| 3174.21 | 71.353 |
| 3176.14 | 71.22 |
| 3178.07 | 71.074 |
| 3180.0 | 70.925 |
| 3181.93 | 70.78 |
| 3183.86 | 70.641 |
| 3185.79 | 70.509 |
| 3187.71 | 70.386 |
| 3189.64 | 70.276 |
| 3191.57 | 70.181 |
| 3193.5 | 70.101 |
| 3195.43 | 70.03 |
| 3197.36 | 69.962 |
| 3199.28 | 69.898 |
| 3201.21 | 69.849 |
| 3203.14 | 69.818 |
| 3205.07 | 69.795 |
| 3207.0 | 69.758 |
| 3208.93 | 69.699 |
| 3210.85 | 69.618 |
| 3212.78 | 69.519 |
| 3214.71 | 69.397 |
| 3216.64 | 69.249 |
| 3218.57 | 69.08 |
| 3220.5 | 68.898 |
| 3222.43 | 68.714 |
| 3224.35 | 68.533 |
| 3226.28 | 68.361 |
| 3228.21 | 68.199 |
| 3230.14 | 68.035 |
| 3232.07 | 67.844 |
| 3234.0 | 67.6 |
| 3235.92 | 67.291 |
| 3237.85 | 66.93 |
| 3239.78 | 66.555 |
| 3241.71 | 66.214 |
| 3243.64 | 65.948 |
| 3245.57 | 65.779 |
| 3247.5 | 65.702 |
| 3249.42 | 65.69 |
| 3251.35 | 65.704 |
| 3253.28 | 65.712 |
| 3255.21 | 65.698 |
| 3257.14 | 65.655 |
| 3259.07 | 65.593 |
| 3260.99 | 65.525 |
| 3262.92 | 65.467 |
| 3264.85 | 65.428 |
| 3266.78 | 65.409 |
| 3268.71 | 65.406 |
| 3270.64 | 65.41 |
| 3272.57 | 65.406 |
| 3274.49 | 65.38 |
| 3276.42 | 65.32 |
| 3278.35 | 65.222 |
| 3280.28 | 65.082 |
| 3282.21 | 64.894 |
| 3284.14 | 64.645 |
| 3286.06 | 64.32 |
| 3287.99 | 63.91 |
| 3289.92 | 63.438 |
| 3291.85 | 62.941 |
| 3293.78 | 62.454 |
| 3295.71 | 62.007 |
| 3297.63 | 61.631 |
| 3299.56 | 61.381 |
| 3301.49 | 61.324 |
| 3303.42 | 61.517 |
| 3305.35 | 61.977 |
| 3307.28 | 62.661 |
| 3309.21 | 63.48 |
| 3311.13 | 64.307 |
| 3313.06 | 65.018 |
| 3314.99 | 65.545 |
| 3316.92 | 65.869 |
| 3318.85 | 66.004 |
| 3320.78 | 65.979 |
| 3322.7 | 65.829 |
| 3324.63 | 65.585 |
| 3326.56 | 65.272 |
| 3328.49 | 64.904 |
| 3330.42 | 64.492 |
| 3332.35 | 64.048 |
| 3334.28 | 63.589 |
| 3336.2 | 63.109 |
| 3338.13 | 62.584 |
| 3340.06 | 61.98 |
| 3341.99 | 61.268 |
| 3343.92 | 60.417 |
| 3345.85 | 59.404 |
| 3347.77 | 58.203 |
| 3349.7 | 56.773 |
| 3351.63 | 55.07 |
| 3353.56 | 53.091 |
| 3355.49 | 50.828 |
| 3357.42 | 48.292 |
| 3359.34 | 45.518 |
| 3361.27 | 42.566 |
| 3363.2 | 39.521 |
| 3365.13 | 36.496 |
| 3367.06 | 33.644 |
| 3368.99 | 31.122 |
| 3370.92 | 29.006 |
| 3372.84 | 27.362 |
| 3374.77 | 26.232 |
| 3376.7 | 25.639 |
| 3378.63 | 25.593 |
| 3380.56 | 26.085 |
| 3382.49 | 27.098 |
| 3384.41 | 28.54 |
| 3386.34 | 30.151 |
| 3388.27 | 31.681 |
| 3390.2 | 32.871 |
| 3392.13 | 33.504 |
| 3394.06 | 33.441 |
| 3395.99 | 32.639 |
| 3397.91 | 31.109 |
| 3399.84 | 29.065 |
| 3401.77 | 26.769 |
| 3403.7 | 24.43 |
| 3405.63 | 22.247 |
| 3407.56 | 20.383 |
| 3409.48 | 18.955 |
| 3411.41 | 18.034 |
| 3413.34 | 17.622 |
| 3415.27 | 17.561 |
| 3417.2 | 17.776 |
| 3419.13 | 18.206 |
| 3421.06 | 18.815 |
| 3422.98 | 19.583 |
| 3424.91 | 20.522 |
| 3426.84 | 21.661 |
| 3428.77 | 22.973 |
| 3430.7 | 24.439 |
| 3432.63 | 26.025 |
| 3434.55 | 27.687 |
| 3436.48 | 29.374 |
| 3438.41 | 31.021 |
| 3440.34 | 32.557 |
| 3442.27 | 33.939 |
| 3444.2 | 35.137 |
| 3446.12 | 36.139 |
| 3448.05 | 36.95 |
| 3449.98 | 37.587 |
| 3451.91 | 38.084 |
| 3453.84 | 38.518 |
| 3455.77 | 38.935 |
| 3457.7 | 39.37 |
| 3459.62 | 39.842 |
| 3461.55 | 40.34 |
| 3463.48 | 40.772 |
| 3465.41 | 41.025 |
| 3467.34 | 40.991 |
| 3469.27 | 40.576 |
| 3471.19 | 39.715 |
| 3473.12 | 38.372 |
| 3475.05 | 36.629 |
| 3476.98 | 34.869 |
| 3478.91 | 33.386 |
| 3480.84 | 32.404 |
| 3482.77 | 32.044 |
| 3484.69 | 32.278 |
| 3486.62 | 32.706 |
| 3488.55 | 32.964 |
| 3490.48 | 32.92 |
| 3492.41 | 32.549 |
| 3494.34 | 31.924 |
| 3496.26 | 31.207 |
| 3498.19 | 30.568 |
| 3500.12 | 30.064 |
| 3502.05 | 29.728 |
| 3503.98 | 29.59 |
| 3505.91 | 29.701 |
| 3507.83 | 30.116 |
| 3509.76 | 30.787 |
| 3511.69 | 31.692 |
| 3513.62 | 32.804 |
| 3515.55 | 34.092 |
| 3517.48 | 35.552 |
| 3519.41 | 37.103 |
| 3521.33 | 38.705 |
| 3523.26 | 40.313 |
| 3525.19 | 41.876 |
| 3527.12 | 43.289 |
| 3529.05 | 44.521 |
| 3530.98 | 45.567 |
| 3532.9 | 46.428 |
| 3534.83 | 47.117 |
| 3536.76 | 47.625 |
| 3538.69 | 48.018 |
| 3540.62 | 48.321 |
| 3542.55 | 48.546 |
| 3544.48 | 48.706 |
| 3546.4 | 48.796 |
| 3548.33 | 48.842 |
| 3550.26 | 48.85 |
| 3552.19 | 48.826 |
| 3554.12 | 48.773 |
| 3556.05 | 48.692 |
| 3557.97 | 48.596 |
| 3559.9 | 48.486 |
| 3561.83 | 48.364 |
| 3563.76 | 48.232 |
| 3565.69 | 48.092 |
| 3567.62 | 47.948 |
| 3569.55 | 47.804 |
| 3571.47 | 47.66 |
| 3573.4 | 47.515 |
| 3575.33 | 47.37 |
| 3577.26 | 47.223 |
| 3579.19 | 47.072 |
| 3581.12 | 46.919 |
| 3583.04 | 46.759 |
| 3584.97 | 46.594 |
| 3586.9 | 46.424 |
| 3588.83 | 46.253 |
| 3590.76 | 46.08 |
| 3592.69 | 45.906 |
| 3594.61 | 45.732 |
| 3596.54 | 45.559 |
| 3598.47 | 45.387 |
| 3600.4 | 45.212 |
| 3602.33 | 45.032 |
| 3604.26 | 44.848 |
| 3606.19 | 44.659 |
| 3608.11 | 44.467 |
| 3610.04 | 44.27 |
| 3611.97 | 44.068 |
| 3613.9 | 43.859 |
| 3615.83 | 43.638 |
| 3617.76 | 43.404 |
| 3619.68 | 43.16 |
| 3621.61 | 42.908 |
| 3623.54 | 42.649 |
| 3625.47 | 42.382 |
| 3627.4 | 42.109 |
| 3629.33 | 41.829 |
| 3631.26 | 41.542 |
| 3633.18 | 41.243 |
| 3635.11 | 40.938 |
| 3637.04 | 40.625 |
| 3638.97 | 40.303 |
| 3640.9 | 39.966 |
| 3642.83 | 39.616 |
| 3644.75 | 39.257 |
| 3646.68 | 38.89 |
| 3648.61 | 38.516 |
| 3650.54 | 38.141 |
| 3652.47 | 37.766 |
| 3654.4 | 37.39 |
| 3656.32 | 37.018 |
| 3658.25 | 36.651 |
| 3660.18 | 36.288 |
| 3662.11 | 35.931 |
| 3664.04 | 35.585 |
| 3665.97 | 35.246 |
| 3667.9 | 34.913 |
| 3669.82 | 34.584 |
| 3671.75 | 34.259 |
| 3673.68 | 33.935 |
| 3675.61 | 33.614 |
| 3677.54 | 33.296 |
| 3679.47 | 32.979 |
| 3681.39 | 32.663 |
| 3683.32 | 32.347 |
| 3685.25 | 32.033 |
| 3687.18 | 31.721 |
| 3689.11 | 31.411 |
| 3691.04 | 31.104 |
| 3692.97 | 30.8 |
| 3694.89 | 30.498 |
| 3696.82 | 30.198 |
| 3698.75 | 29.899 |
| 3700.68 | 29.602 |
| 3702.61 | 29.307 |
| 3704.54 | 29.015 |
| 3706.46 | 28.726 |
| 3708.39 | 28.444 |
| 3710.32 | 28.168 |
| 3712.25 | 27.897 |
| 3714.18 | 27.633 |
| 3716.11 | 27.379 |
| 3718.04 | 27.133 |
| 3719.96 | 26.894 |
| 3721.89 | 26.668 |
| 3723.82 | 26.448 |
| 3725.75 | 26.235 |
| 3727.68 | 26.028 |
| 3729.61 | 25.833 |
| 3731.53 | 25.647 |
| 3733.46 | 25.471 |
| 3735.39 | 25.309 |
| 3737.32 | 25.156 |
| 3739.25 | 25.011 |
| 3741.18 | 24.872 |
| 3743.1 | 24.742 |
| 3745.03 | 24.619 |
| 3746.96 | 24.503 |
| 3748.89 | 24.397 |
| 3750.82 | 24.3 |
| 3752.75 | 24.208 |
| 3754.68 | 24.122 |
| 3756.6 | 24.043 |
| 3758.53 | 23.967 |
| 3760.46 | 23.895 |
| 3762.39 | 23.83 |
| 3764.32 | 23.768 |
| 3766.25 | 23.711 |
| 3768.17 | 23.66 |
| 3770.1 | 23.614 |
| 3772.03 | 23.573 |
| 3773.96 | 23.535 |
| 3775.89 | 23.502 |
| 3777.82 | 23.472 |
| 3779.75 | 23.445 |
| 3781.67 | 23.423 |
| 3783.6 | 23.404 |
| 3785.53 | 23.387 |
| 3787.46 | 23.371 |
| 3789.39 | 23.358 |
| 3791.32 | 23.347 |
| 3793.24 | 23.339 |
| 3795.17 | 23.333 |
| 3797.1 | 23.327 |
| 3799.03 | 23.32 |
| 3800.96 | 23.313 |
| 3802.89 | 23.308 |
| 3804.81 | 23.305 |
| 3806.74 | 23.302 |
| 3808.67 | 23.297 |
| 3810.6 | 23.292 |
| 3812.53 | 23.285 |
| 3814.46 | 23.276 |
| 3816.39 | 23.267 |
| 3818.31 | 23.256 |
| 3820.24 | 23.243 |
| 3822.17 | 23.229 |
| 3824.1 | 23.216 |
| 3826.03 | 23.202 |
| 3827.96 | 23.186 |
| 3829.88 | 23.17 |
| 3831.81 | 23.153 |
| 3833.74 | 23.135 |
| 3835.67 | 23.118 |
| 3837.6 | 23.102 |
| 3839.53 | 23.087 |
| 3841.46 | 23.071 |
| 3843.38 | 23.052 |
| 3845.31 | 23.029 |
| 3847.24 | 23.002 |
| 3849.17 | 22.972 |
| 3851.1 | 22.939 |
| 3853.03 | 22.906 |
| 3854.95 | 22.872 |
| 3856.88 | 22.836 |
| 3858.81 | 22.799 |
| 3860.74 | 22.76 |
| 3862.67 | 22.72 |
| 3864.6 | 22.678 |
| 3866.53 | 22.636 |
| 3868.45 | 22.592 |
| 3870.38 | 22.549 |
| 3872.31 | 22.506 |
| 3874.24 | 22.464 |
| 3876.17 | 22.422 |
| 3878.1 | 22.381 |
| 3880.02 | 22.339 |
| 3881.95 | 22.297 |
| 3883.88 | 22.255 |
| 3885.81 | 22.212 |
| 3887.74 | 22.169 |
| 3889.67 | 22.124 |
| 3891.59 | 22.078 |
| 3893.52 | 22.032 |
| 3895.45 | 21.984 |
| 3897.38 | 21.936 |
| 3899.31 | 21.886 |
| 3901.24 | 21.834 |
| 3903.17 | 21.781 |
| 3905.09 | 21.726 |
| 3907.02 | 21.669 |
| 3908.95 | 21.611 |
| 3910.88 | 21.554 |
| 3912.81 | 21.496 |
| 3914.74 | 21.439 |
| 3916.66 | 21.382 |
| 3918.59 | 21.324 |
| 3920.52 | 21.266 |
| 3922.45 | 21.209 |
| 3924.38 | 21.151 |
| 3926.31 | 21.093 |
| 3928.24 | 21.033 |
| 3930.16 | 20.969 |
| 3932.09 | 20.904 |
| 3934.02 | 20.837 |
| 3935.95 | 20.769 |
| 3937.88 | 20.7 |
| 3939.81 | 20.632 |
| 3941.73 | 20.563 |
| 3943.66 | 20.494 |
| 3945.59 | 20.424 |
| 3947.52 | 20.354 |
| 3949.45 | 20.284 |
| 3951.38 | 20.213 |
| 3953.3 | 20.143 |
| 3955.23 | 20.072 |
| 3957.16 | 20 |
| 3959.09 | 19.928 |
| 3961.02 | 19.854 |
| 3962.95 | 19.777 |
| 3964.88 | 19.699 |
| 3966.8 | 19.619 |
| 3968.73 | 19.538 |
| 3970.66 | 19.456 |
| 3972.59 | 19.371 |
| 3974.52 | 19.284 |
| 3976.45 | 19.194 |
| 3978.37 | 19.099 |
| 3980.3 | 19.001 |
| 3982.23 | 18.9 |
| 3984.16 | 18.795 |
| 3986.09 | 18.689 |
| 3988.02 | 18.581 |
| 3989.95 | 18.47 |
| 3991.87 | 18.358 |
| 3993.8 | 18.241 |
| 3995.73 | 18.122 |
| 3997.66 | 18 |
| 3999.59 | 17.875 |
| 4001.52 | 17.749 |
| 4003.44 | 17.618 |
| 4005.37 | 17.484 |
| 4007.3 | 17.348 |
| 4009.23 | 17.206 |
| 4011.16 | 17.062 |
| 4013.09 | 16.914 |
| 4015.02 | 16.763 |
| 4016.94 | 16.61 |
| 4018.87 | 16.456 |
| 4020.8 | 16.301 |
| 4022.73 | 16.146 |
| 4024.66 | 15.989 |
| 4026.59 | 15.832 |
| 4028.51 | 15.674 |
| 4030.44 | 15.515 |
| 4032.37 | 15.354 |
| 4034.3 | 15.192 |
| 4036.23 | 15.029 |
| 4038.16 | 14.864 |
| 4040.08 | 14.699 |
| 4042.01 | 14.533 |
| 4043.94 | 14.367 |
| 4045.87 | 14.199 |
| 4047.8 | 14.031 |
| 4049.73 | 13.861 |
| 4051.66 | 13.692 |
| 4053.58 | 13.522 |
| 4055.51 | 13.352 |
| 4057.44 | 13.183 |
| 4059.37 | 13.013 |
| 4061.3 | 12.844 |
| 4063.23 | 12.675 |
| 4065.15 | 12.507 |
| 4067.08 | 12.34 |
| 4069.01 | 12.174 |
| 4070.94 | 12.009 |
| 4072.87 | 11.846 |
| 4074.8 | 11.686 |
| 4076.73 | 11.526 |
| 4078.65 | 11.368 |
| 4080.58 | 11.21 |
| 4082.51 | 11.052 |
| 4084.44 | 10.894 |
| 4086.37 | 10.738 |
| 4088.3 | 10.585 |
| 4090.22 | 10.434 |
| 4092.15 | 10.287 |
| 4094.08 | 10.142 |
| 4096.01 | 9.998 |
| 4097.94 | 9.856 |
| 4099.87 | 9.715 |
| 4101.79 | 9.575 |
| 4103.72 | 9.437 |
| 4105.65 | 9.299 |
| 4107.58 | 9.164 |
| 4109.51 | 9.03 |
| 4111.44 | 8.898 |
| 4113.37 | 8.77 |
| 4115.29 | 8.643 |
| 4117.22 | 8.521 |
| 4119.15 | 8.4 |
| 4121.08 | 8.282 |
| 4123.01 | 8.165 |
| 4124.94 | 8.05 |
| 4126.86 | 7.938 |
| 4128.79 | 7.826 |
| 4130.72 | 7.719 |
| 4132.65 | 7.613 |
| 4134.58 | 7.511 |
| 4136.51 | 7.411 |
| 4138.44 | 7.313 |
| 4140.36 | 7.219 |
| 4142.29 | 7.125 |
| 4144.22 | 7.035 |
| 4146.15 | 6.946 |
| 4148.08 | 6.86 |
| 4150.01 | 6.777 |
| 4151.93 | 6.695 |
| 4153.86 | 6.616 |
| 4155.79 | 6.538 |
| 4157.72 | 6.462 |
| 4159.65 | 6.389 |
| 4161.58 | 6.316 |
| 4163.51 | 6.246 |
| 4165.43 | 6.177 |
| 4167.36 | 6.111 |
| 4169.29 | 6.047 |
| 4171.22 | 5.983 |
| 4173.15 | 5.923 |
| 4175.08 | 5.863 |
| 4177.0 | 5.807 |
| 4178.93 | 5.752 |
| 4180.86 | 5.697 |
| 4182.79 | 5.643 |
| 4184.72 | 5.588 |
| 4186.65 | 5.533 |
| 4188.57 | 5.478 |
| 4190.5 | 5.424 |
| 4192.43 | 5.371 |
| 4194.36 | 5.32 |
| 4196.29 | 5.27 |
| 4198.22 | 5.221 |
| 4200.15 | 5.173 |
| 4202.07 | 5.125 |
| 4204.0 | 5.075 |
| 4205.93 | 5.025 |
| 4207.86 | 4.973 |
| 4209.79 | 4.918 |
| 4211.72 | 4.861 |
| 4213.64 | 4.802 |
| 4215.57 | 4.742 |
| 4217.5 | 4.681 |
| 4219.43 | 4.621 |
| 4221.36 | 4.563 |
| 4223.29 | 4.505 |
| 4225.22 | 4.446 |
| 4227.14 | 4.384 |
| 4229.07 | 4.319 |
| 4231.0 | 4.248 |
| 4232.93 | 4.176 |
| 4234.86 | 4.098 |
| 4236.79 | 4.02 |
| 4238.71 | 3.943 |
| 4240.64 | 3.866 |
| 4242.57 | 3.79 |
| 4244.5 | 3.712 |
| 4246.43 | 3.631 |
| 4248.36 | 3.545 |
| 4250.28 | 3.457 |
| 4252.21 | 3.374 |
| 4254.14 | 3.293 |
| 4256.07 | 3.223 |
| 4258.0 | 3.153 |
| 4259.93 | 3.085 |
| 4261.86 | 3.013 |
| 4263.78 | 2.936 |
| 4265.71 | 2.853 |
| 4267.64 | 2.767 |
| 4269.57 | 2.68 |
| 4271.5 | 2.592 |
| 4273.43 | 2.506 |
| 4275.35 | 2.421 |
| 4277.28 | 2.342 |
| 4279.21 | 2.265 |
| 4281.14 | 2.194 |
| 4283.07 | 2.124 |
| 4285.0 | 2.056 |
| 4286.93 | 1.986 |
| 4288.85 | 1.916 |
| 4290.78 | 1.845 |
| 4292.71 | 1.774 |
| 4294.64 | 1.704 |
| 4296.57 | 1.636 |
| 4298.5 | 1.572 |
| 4300.42 | 1.511 |
| 4302.35 | 1.453 |
| 4304.28 | 1.398 |
| 4306.21 | 1.344 |
| 4308.14 | 1.291 |
| 4310.07 | 1.239 |
| 4312.0 | 1.19 |
| 4313.92 | 1.141 |
| 4315.85 | 1.097 |
| 4317.78 | 1.054 |
| 4319.71 | 1.012 |
| 4321.64 | 0.972 |
| 4323.57 | 0.932 |
| 4325.49 | 0.892 |
| 4327.42 | 0.854 |
| 4329.35 | 0.817 |
| 4331.28 | 0.781 |
| 4333.21 | 0.748 |
| 4335.14 | 0.716 |
| 4337.06 | 0.688 |
| 4338.99 | 0.66 |
| 4340.92 | 0.636 |
| 4342.85 | 0.612 |
| 4344.78 | 0.59 |
| 4346.71 | 0.568 |
| 4348.64 | 0.548 |
| 4350.56 | 0.528 |
| 4352.49 | 0.509 |
| 4354.42 | 0.491 |
| 4356.35 | 0.474 |
| 4358.28 | 0.457 |
| 4360.21 | 0.442 |
| 4362.13 | 0.427 |
| 4364.06 | 0.413 |
| 4365.99 | 0.399 |
| 4367.92 | 0.386 |
| 4369.85 | 0.373 |
| 4371.78 | 0.361 |
| 4373.71 | 0.35 |
| 4375.63 | 0.339 |
| 4377.56 | 0.33 |
| 4379.49 | 0.321 |
| 4381.42 | 0.314 |
| 4383.35 | 0.306 |
| 4385.28 | 0.3 |
| 4387.2 | 0.294 |
| 4389.13 | 0.289 |
| 4391.06 | 0.284 |
| 4392.99 | 0.28 |
| 4394.92 | 0.275 |
| 4396.85 | 0.271 |
| 4398.77 | 0.267 |
| 4400.7 | 0.265 |
| 4402.63 | 0.263 |
| 4404.56 | 0.261 |
| 4406.49 | 0.259 |
| 4408.42 | 0.257 |
| 4410.35 | 0.255 |
| 4412.27 | 0.252 |
| 4414.2 | 0.249 |
| 4416.13 | 0.246 |
| 4418.06 | 0.244 |
| 4419.99 | 0.243 |
| 4421.92 | 0.242 |
| 4423.84 | 0.242 |
| 4425.77 | 0.242 |
| 4427.7 | 0.242 |
| 4429.63 | 0.243 |
| 4431.56 | 0.243 |
| 4433.49 | 0.243 |
| 4435.42 | 0.243 |
| 4437.34 | 0.244 |
| 4439.27 | 0.245 |
| 4441.2 | 0.247 |
| 4443.13 | 0.249 |
| 4445.06 | 0.251 |
| 4446.99 | 0.253 |
| 4448.91 | 0.253 |
| 4450.84 | 0.254 |
| 4452.77 | 0.252 |
| 4454.7 | 0.25 |
| 4456.63 | 0.246 |
| 4458.56 | 0.242 |
| 4460.49 | 0.238 |
| 4462.41 | 0.235 |
| 4464.34 | 0.235 |
| 4466.27 | 0.236 |
| 4468.2 | 0.241 |
| 4470.13 | 0.248 |
| 4472.06 | 0.258 |
| 4473.98 | 0.268 |
| 4475.91 | 0.281 |
| 4477.84 | 0.293 |
| 4479.77 | 0.307 |
| 4481.7 | 0.32 |
| 4483.63 | 0.333 |
| 4485.55 | 0.345 |
| 4487.48 | 0.356 |
| 4489.41 | 0.366 |
| 4491.34 | 0.375 |
| 4493.27 | 0.384 |
| 4495.2 | 0.392 |
| 4497.13 | 0.4 |
| 4499.05 | 0.409 |
| 4500.98 | 0.419 |
| 4502.91 | 0.43 |
| 4504.84 | 0.442 |
| 4506.77 | 0.455 |
| 4508.7 | 0.468 |
| 4510.62 | 0.48 |
| 4512.55 | 0.493 |
| 4514.48 | 0.506 |
| 4516.41 | 0.519 |
| 4518.34 | 0.531 |
| 4520.27 | 0.544 |
| 4522.2 | 0.556 |
| 4524.12 | 0.569 |
| 4526.05 | 0.58 |
| 4527.98 | 0.592 |
| 4529.91 | 0.602 |
| 4531.84 | 0.613 |
| 4533.77 | 0.622 |
| 4535.69 | 0.632 |
| 4537.62 | 0.64 |
| 4539.55 | 0.648 |
| 4541.48 | 0.655 |
| 4543.41 | 0.661 |
| 4545.34 | 0.668 |
| 4547.26 | 0.673 |
| 4549.19 | 0.679 |
| 4551.12 | 0.685 |
| 4553.05 | 0.69 |
| 4554.98 | 0.694 |
| 4556.91 | 0.698 |
| 4558.84 | 0.7 |
| 4560.76 | 0.703 |
| 4562.69 | 0.704 |
| 4564.62 | 0.705 |
| 4566.55 | 0.705 |
| 4568.48 | 0.704 |
| 4570.41 | 0.703 |
| 4572.33 | 0.701 |
| 4574.26 | 0.699 |
| 4576.19 | 0.696 |
| 4578.12 | 0.693 |
| 4580.05 | 0.689 |
| 4581.98 | 0.685 |
| 4583.91 | 0.68 |
| 4585.83 | 0.675 |
| 4587.76 | 0.668 |
| 4589.69 | 0.662 |
| 4591.62 | 0.655 |
| 4593.55 | 0.648 |
| 4595.48 | 0.641 |
| 4597.4 | 0.633 |
| 4599.33 | 0.625 |
| 4601.26 | 0.616 |
| 4603.19 | 0.607 |
| 4605.12 | 0.597 |
| 4607.05 | 0.587 |
| 4608.98 | 0.577 |
| 4610.9 | 0.567 |
| 4612.83 | 0.557 |
| 4614.76 | 0.546 |
| 4616.69 | 0.536 |
| 4618.62 | 0.526 |
| 4620.55 | 0.515 |
| 4622.47 | 0.505 |
| 4624.4 | 0.494 |
| 4626.33 | 0.482 |
| 4628.26 | 0.47 |
| 4630.19 | 0.457 |
| 4632.12 | 0.444 |
| 4634.04 | 0.431 |
| 4635.97 | 0.418 |
| 4637.9 | 0.405 |
| 4639.83 | 0.394 |
| 4641.76 | 0.382 |
| 4643.69 | 0.372 |
| 4645.62 | 0.362 |
| 4647.54 | 0.352 |
| 4649.47 | 0.343 |
| 4651.4 | 0.333 |
| 4653.33 | 0.323 |
| 4655.26 | 0.312 |
| 4657.19 | 0.3 |
| 4659.11 | 0.289 |
| 4661.04 | 0.278 |
| 4662.97 | 0.267 |
| 4664.9 | 0.257 |
| 4666.83 | 0.247 |
| 4668.76 | 0.238 |
| 4670.69 | 0.229 |
| 4672.61 | 0.219 |
| 4674.54 | 0.21 |
| 4676.47 | 0.201 |
| 4678.4 | 0.192 |
| 4680.33 | 0.184 |
| 4682.26 | 0.177 |
| 4684.18 | 0.169 |
| 4686.11 | 0.163 |
| 4688.04 | 0.156 |
| 4689.97 | 0.149 |
| 4691.9 | 0.142 |
| 4693.83 | 0.135 |
| 4695.75 | 0.129 |
| 4697.68 | 0.122 |
| 4699.61 | 0.116 |
| 4701.54 | 0.11 |
| 4703.47 | 0.104 |
| 4705.4 | 0.097 |
| 4707.33 | 0.091 |
| 4709.25 | 0.086 |
| 4711.18 | 0.08 |
| 4713.11 | 0.075 |
| 4715.04 | 0.07 |
| 4716.97 | 0.066 |
| 4718.9 | 0.062 |
| 4720.82 | 0.058 |
| 4722.75 | 0.054 |
| 4724.68 | 0.05 |
| 4726.61 | 0.046 |
| 4728.54 | 0.043 |
| 4730.47 | 0.04 |
| 4732.4 | 0.037 |
| 4734.32 | 0.036 |
| 4736.25 | 0.035 |
| 4738.18 | 0.033 |
| 4740.11 | 0.032 |
| 4742.04 | 0.03 |
| 4743.97 | 0.028 |
| 4745.89 | 0.025 |
| 4747.82 | 0.023 |
| 4749.75 | 0.02 |
| 4751.68 | 0.018 |
| 4753.61 | 0.017 |
| 4755.54 | 0.016 |
| 4757.47 | 0.016 |
| 4759.39 | 0.016 |
| 4761.32 | 0.016 |
| 4763.25 | 0.016 |
| 4765.18 | 0.017 |
| 4767.11 | 0.018 |
| 4769.04 | 0.019 |
| 4770.96 | 0.019 |
| 4772.89 | 0.018 |
| 4774.82 | 0.018 |
| 4776.75 | 0.016 |
| 4778.68 | 0.014 |
| 4780.61 | 0.012 |
| 4782.53 | 0.011 |
| 4784.46 | 0.01 |
| 4786.39 | 0.011 |
| 4788.32 | 0.013 |
| 4790.25 | 0.015 |
| 4792.18 | 0.017 |
| 4794.11 | 0.018 |
| 4796.03 | 0.019 |
| 4797.96 | 0.019 |
| 4799.89 | 0.018 |
| 4801.82 | 0.017 |
| 4803.75 | 0.014 |
| 4805.68 | 0.012 |
| 4807.6 | 0.011 |
| 4809.53 | 0.009 |
| 4811.46 | 0.009 |
| 4813.39 | 0.009 |
| 4815.32 | 0.01 |
| 4817.25 | 0.012 |
| 4819.18 | 0.013 |
| 4821.1 | 0.014 |
| 4823.03 | 0.014 |
| 4824.96 | 0.014 |
| 4826.89 | 0.014 |
| 4828.82 | 0.013 |
| 4830.75 | 0.013 |
| 4832.67 | 0.012 |
| 4834.6 | 0.012 |
| 4836.53 | 0.012 |
| 4838.46 | 0.013 |
| 4840.39 | 0.013 |
| 4842.32 | 0.014 |
| 4844.24 | 0.015 |
| 4846.17 | 0.016 |
| 4848.1 | 0.016 |
| 4850.03 | 0.016 |
| 4851.96 | 0.016 |
| 4853.89 | 0.015 |
| 4855.82 | 0.015 |
| 4857.74 | 0.014 |
| 4859.67 | 0.013 |
| 4861.6 | 0.013 |
| 4863.53 | 0.012 |
| 4865.46 | 0.012 |
| 4867.39 | 0.012 |
| 4869.31 | 0.012 |
| 4871.24 | 0.012 |
| 4873.17 | 0.013 |
| 4875.1 | 0.014 |
| 4877.03 | 0.015 |
| 4878.96 | 0.016 |
| 4880.89 | 0.017 |
| 4882.81 | 0.018 |
| 4884.74 | 0.019 |
| 4886.67 | 0.02 |
| 4888.6 | 0.021 |
| 4890.53 | 0.021 |
| 4892.46 | 0.021 |
| 4894.38 | 0.021 |
| 4896.31 | 0.02 |
| 4898.24 | 0.019 |
| 4900.17 | 0.017 |
| 4902.1 | 0.015 |
| 4904.03 | 0.014 |
| 4905.96 | 0.012 |
| 4907.88 | 0.011 |
| 4909.81 | 0.01 |
| 4911.74 | 0.009 |
| 4913.67 | 0.009 |
| 4915.6 | 0.009 |
| 4917.53 | 0.009 |
| 4919.45 | 0.01 |
| 4921.38 | 0.011 |
| 4923.31 | 0.012 |
| 4925.24 | 0.013 |
| 4927.17 | 0.014 |
| 4929.1 | 0.014 |
| 4931.02 | 0.014 |
| 4932.95 | 0.014 |
| 4934.88 | 0.014 |
| 4936.81 | 0.014 |
| 4938.74 | 0.014 |
| 4940.67 | 0.014 |
| 4942.6 | 0.013 |
| 4944.52 | 0.013 |
| 4946.45 | 0.013 |
| 4948.38 | 0.013 |
| 4950.31 | 0.013 |
| 4952.24 | 0.013 |
| 4954.17 | 0.012 |
| 4956.09 | 0.012 |
| 4958.02 | 0.012 |
| 4959.95 | 0.012 |
| 4961.88 | 0.012 |
| 4963.81 | 0.012 |
| 4965.74 | 0.012 |
| 4967.67 | 0.013 |
| 4969.59 | 0.013 |
| 4971.52 | 0.014 |
| 4973.45 | 0.014 |
| 4975.38 | 0.014 |
| 4977.31 | 0.014 |
| 4979.24 | 0.013 |
| 4981.16 | 0.013 |
| 4983.09 | 0.012 |
| 4985.02 | 0.011 |
| 4986.95 | 0.011 |
| 4988.88 | 0.011 |
| 4990.81 | 0.011 |
| 4992.73 | 0.012 |
| 4994.66 | 0.012 |
| 4996.59 | 0.012 |
| 4998.52 | 0.013 |